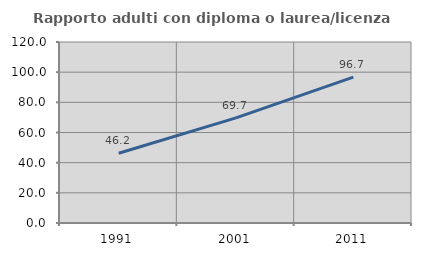
| Category | Rapporto adulti con diploma o laurea/licenza media  |
|---|---|
| 1991.0 | 46.234 |
| 2001.0 | 69.692 |
| 2011.0 | 96.722 |